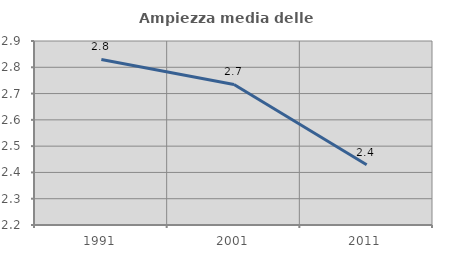
| Category | Ampiezza media delle famiglie |
|---|---|
| 1991.0 | 2.83 |
| 2001.0 | 2.735 |
| 2011.0 | 2.429 |